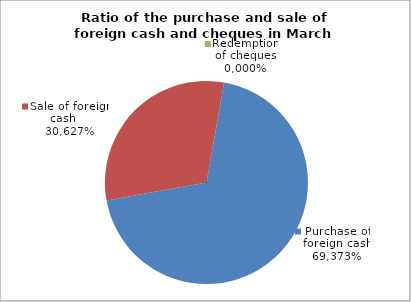
| Category | Purchase of foreign cash |
|---|---|
| 0 | 0.694 |
| 1 | 0.306 |
| 2 | 0 |